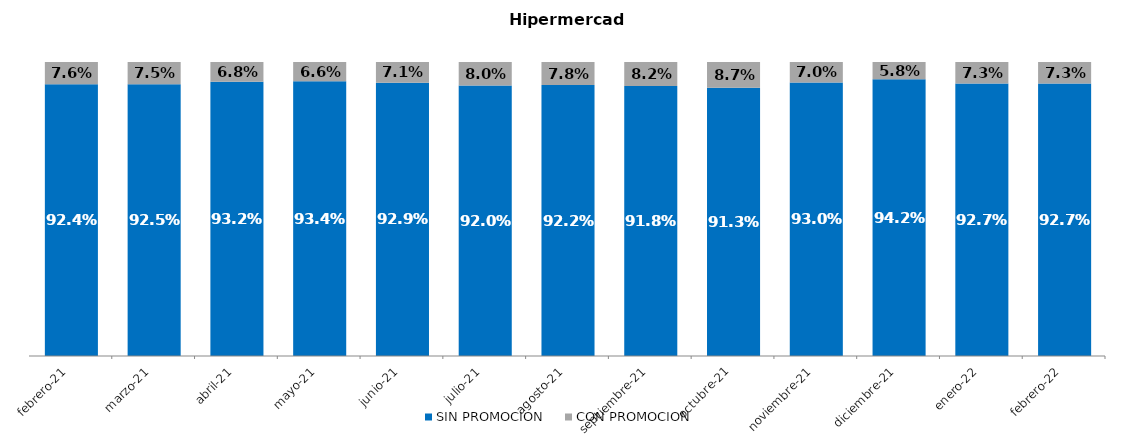
| Category | SIN PROMOCION   | CON PROMOCION   |
|---|---|---|
| 2021-02-01 | 0.924 | 0.076 |
| 2021-03-01 | 0.925 | 0.075 |
| 2021-04-01 | 0.932 | 0.068 |
| 2021-05-01 | 0.934 | 0.066 |
| 2021-06-01 | 0.929 | 0.071 |
| 2021-07-01 | 0.92 | 0.08 |
| 2021-08-01 | 0.922 | 0.078 |
| 2021-09-01 | 0.918 | 0.082 |
| 2021-10-01 | 0.913 | 0.087 |
| 2021-11-01 | 0.93 | 0.07 |
| 2021-12-01 | 0.942 | 0.058 |
| 2022-01-01 | 0.927 | 0.073 |
| 2022-02-01 | 0.927 | 0.073 |